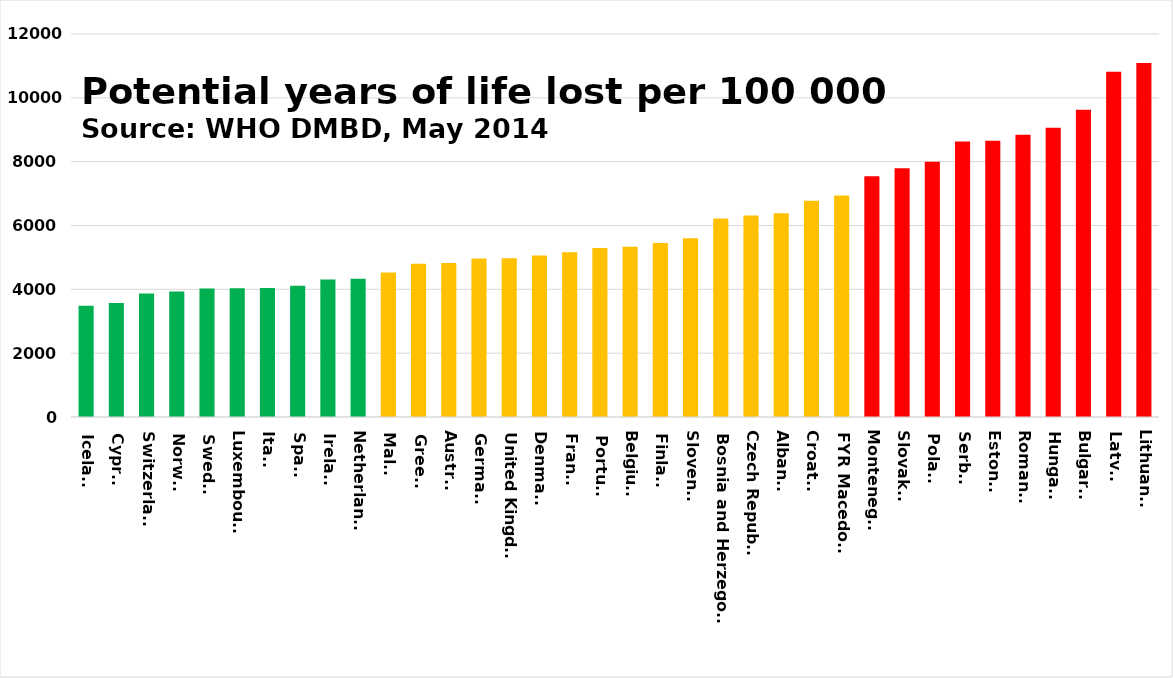
| Category | Series 0 |
|---|---|
| Iceland | 3483.833 |
| Cyprus | 3574.469 |
| Switzerland | 3871.98 |
| Norway | 3932.454 |
| Sweden | 4024.137 |
| Luxembourg | 4031.062 |
| Italy | 4038.857 |
| Spain | 4109.331 |
| Ireland | 4309.937 |
| Netherlands | 4329.466 |
| Malta | 4529.226 |
| Greece | 4805.27 |
| Austria | 4824.94 |
| Germany | 4964.321 |
| United Kingdom | 4976.457 |
| Denmark | 5060.562 |
| France | 5164.924 |
| Portugal | 5294.723 |
| Belgium | 5333.852 |
| Finland | 5452.646 |
| Slovenia | 5604.426 |
| Bosnia and Herzegovina | 6221.691 |
| Czech Republic | 6309.559 |
| Albania | 6380.655 |
| Croatia | 6773.993 |
| FYR Macedonia | 6937.155 |
| Montenegro | 7542.229 |
| Slovakia | 7792.944 |
| Poland | 7999.79 |
| Serbia | 8634.638 |
| Estonia | 8658.93 |
| Romania | 8841.591 |
| Hungary | 9061.914 |
| Bulgaria | 9625.809 |
| Latvia | 10818.58 |
| Lithuania | 11090.895 |